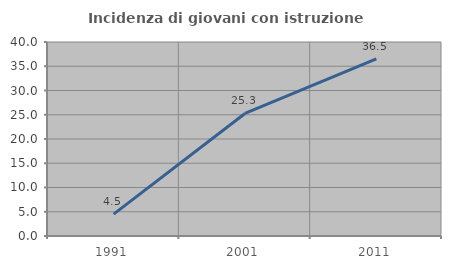
| Category | Incidenza di giovani con istruzione universitaria |
|---|---|
| 1991.0 | 4.514 |
| 2001.0 | 25.267 |
| 2011.0 | 36.531 |